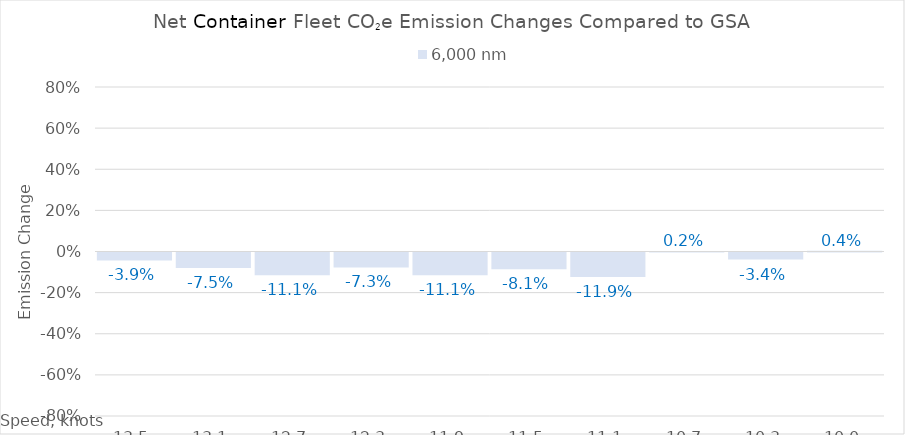
| Category | 6,000 |
|---|---|
| 13.5 | -0.039 |
| 13.1 | -0.075 |
| 12.7 | -0.111 |
| 12.299999999999999 | -0.073 |
| 11.899999999999999 | -0.111 |
| 11.499999999999998 | -0.081 |
| 11.099999999999998 | -0.119 |
| 10.699999999999998 | 0.002 |
| 10.299999999999997 | -0.034 |
| 10.0 | 0.004 |